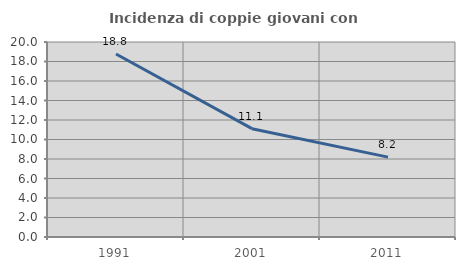
| Category | Incidenza di coppie giovani con figli |
|---|---|
| 1991.0 | 18.773 |
| 2001.0 | 11.111 |
| 2011.0 | 8.191 |